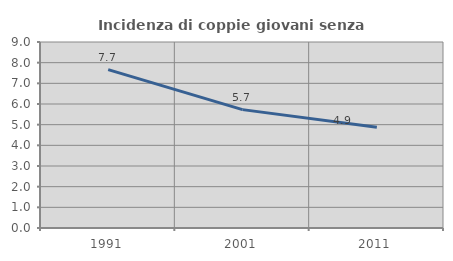
| Category | Incidenza di coppie giovani senza figli |
|---|---|
| 1991.0 | 7.666 |
| 2001.0 | 5.728 |
| 2011.0 | 4.876 |